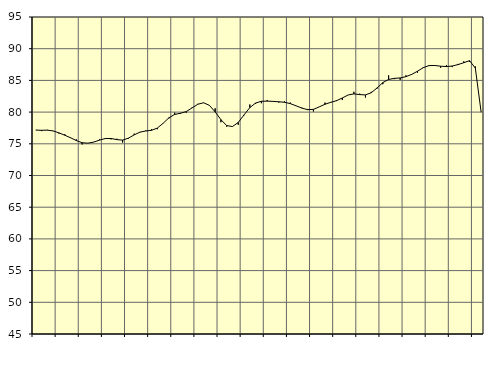
| Category | Piggar | Samtliga sysselsatta (inkl. sysselsatta utomlands) |
|---|---|---|
| nan | 77.2 | 77.16 |
| 1.0 | 77 | 77.13 |
| 1.0 | 77.2 | 77.15 |
| 1.0 | 77 | 77.03 |
| nan | 76.6 | 76.72 |
| 2.0 | 76.5 | 76.35 |
| 2.0 | 76 | 75.95 |
| 2.0 | 75.7 | 75.51 |
| nan | 74.9 | 75.17 |
| 3.0 | 75.1 | 75.1 |
| 3.0 | 75.3 | 75.27 |
| 3.0 | 75.7 | 75.58 |
| nan | 75.9 | 75.83 |
| 4.0 | 75.7 | 75.84 |
| 4.0 | 75.8 | 75.66 |
| 4.0 | 75.2 | 75.58 |
| nan | 75.8 | 75.89 |
| 5.0 | 76.6 | 76.41 |
| 5.0 | 76.8 | 76.84 |
| 5.0 | 77.1 | 77.02 |
| nan | 77.3 | 77.13 |
| 6.0 | 77.3 | 77.48 |
| 6.0 | 78.2 | 78.23 |
| 6.0 | 79 | 79.1 |
| nan | 79.9 | 79.63 |
| 7.0 | 79.7 | 79.82 |
| 7.0 | 79.9 | 80.08 |
| 7.0 | 80.7 | 80.65 |
| nan | 81.3 | 81.24 |
| 8.0 | 81.5 | 81.47 |
| 8.0 | 81.1 | 81.07 |
| 8.0 | 80.6 | 80.04 |
| nan | 78.4 | 78.81 |
| 9.0 | 77.7 | 77.87 |
| 9.0 | 77.7 | 77.72 |
| 9.0 | 78 | 78.37 |
| nan | 79.5 | 79.56 |
| 10.0 | 81.2 | 80.71 |
| 10.0 | 81.3 | 81.43 |
| 10.0 | 81.4 | 81.71 |
| nan | 81.9 | 81.73 |
| 11.0 | 81.7 | 81.69 |
| 11.0 | 81.5 | 81.63 |
| 11.0 | 81.7 | 81.55 |
| nan | 81.5 | 81.34 |
| 12.0 | 81 | 80.99 |
| 12.0 | 80.7 | 80.63 |
| 12.0 | 80.5 | 80.38 |
| nan | 80.1 | 80.43 |
| 13.0 | 80.8 | 80.82 |
| 13.0 | 81.5 | 81.24 |
| 13.0 | 81.6 | 81.54 |
| nan | 81.9 | 81.8 |
| 14.0 | 81.9 | 82.23 |
| 14.0 | 82.7 | 82.7 |
| 14.0 | 83.2 | 82.87 |
| nan | 82.9 | 82.76 |
| 15.0 | 82.3 | 82.71 |
| 15.0 | 83.2 | 83.05 |
| 15.0 | 83.7 | 83.81 |
| nan | 84.4 | 84.65 |
| 16.0 | 85.8 | 85.15 |
| 16.0 | 85.2 | 85.32 |
| 16.0 | 85.1 | 85.39 |
| nan | 85.8 | 85.59 |
| 17.0 | 85.9 | 85.95 |
| 17.0 | 86.2 | 86.45 |
| 17.0 | 87.1 | 87.01 |
| nan | 87.4 | 87.34 |
| 18.0 | 87.3 | 87.35 |
| 18.0 | 87 | 87.24 |
| 18.0 | 87.4 | 87.18 |
| nan | 87.1 | 87.27 |
| 19.0 | 87.6 | 87.49 |
| 19.0 | 88 | 87.79 |
| 19.0 | 87.9 | 88.11 |
| nan | 87.2 | 86.96 |
| 20.0 | 80 | 80.04 |